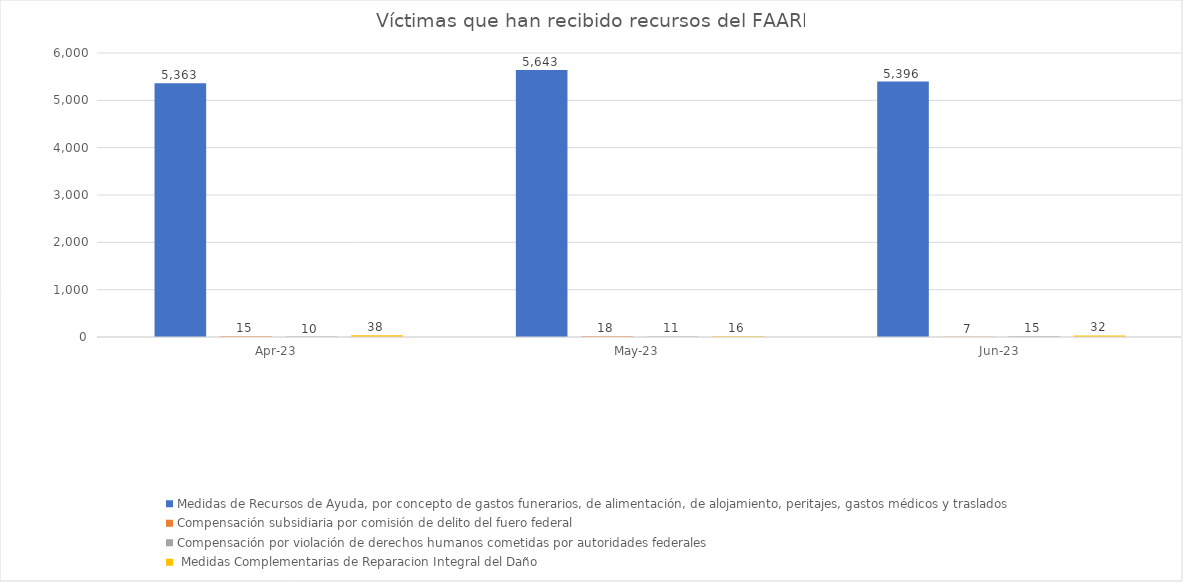
| Category | Medidas de Recursos de Ayuda, por concepto de gastos funerarios, de alimentación, de alojamiento, peritajes, gastos médicos y traslados | Compensación subsidiaria por comisión de delito del fuero federal | Compensación por violación de derechos humanos cometidas por autoridades federales |  Medidas Complementarias de Reparacion Integral del Daño |
|---|---|---|---|---|
| 2023-04-01 | 5363 | 15 | 10 | 38 |
| 2023-05-01 | 5643 | 18 | 11 | 16 |
| 2023-06-01 | 5396 | 7 | 15 | 32 |